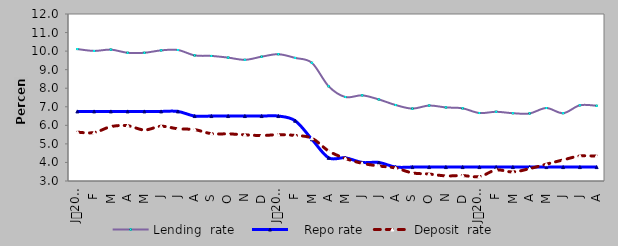
| Category | Lending  rate |    Repo rate | Deposit  rate |
|---|---|---|---|
| 0 | 10.11 | 6.75 | 5.63 |
| 1900-01-01 | 10.01 | 6.75 | 5.61 |
| 1900-01-02 | 10.08 | 6.75 | 5.93 |
| 1900-01-03 | 9.91 | 6.75 | 5.98 |
| 1900-01-04 | 9.91 | 6.75 | 5.75 |
| 1900-01-05 | 10.04 | 6.75 | 5.95 |
| 1900-01-06 | 10.06 | 6.75 | 5.813 |
| 1900-01-07 | 9.77 | 6.5 | 5.77 |
| 1900-01-08 | 9.74 | 6.5 | 5.55 |
| 1900-01-09 | 9.65 | 6.5 | 5.54 |
| 1900-01-10 | 9.53 | 6.5 | 5.49 |
| 1900-01-11 | 9.7 | 6.5 | 5.45 |
| 1900-01-12 | 9.833 | 6.5 | 5.497 |
| 1900-01-13 | 9.634 | 6.25 | 5.454 |
| 1900-01-14 | 9.369 | 5.25 | 5.304 |
| 1900-01-15 | 8.106 | 4.25 | 4.617 |
| 1900-01-16 | 7.526 | 4.25 | 4.216 |
| 1900-01-17 | 7.616 | 4 | 3.953 |
| 1900-01-18 | 7.394 | 4 | 3.809 |
| 1900-01-19 | 7.095 | 3.75 | 3.699 |
| 1900-01-20 | 6.902 | 3.75 | 3.437 |
| 1900-01-21 | 7.067 | 3.75 | 3.374 |
| 1900-01-22 | 6.965 | 3.75 | 3.276 |
| 1900-01-23 | 6.917 | 3.75 | 3.292 |
| 1900-01-24 | 6.663 | 3.75 | 3.236 |
| 1900-01-25 | 6.731 | 3.75 | 3.592 |
| 1900-01-26 | 6.653 | 3.75 | 3.488 |
| 1900-01-27 | 6.64 | 3.75 | 3.667 |
| 1900-01-28 | 6.933 | 3.75 | 3.907 |
| 1900-01-29 | 6.654 | 3.75 | 4.137 |
| 1900-01-30 | 7.081 | 3.75 | 4.347 |
| 1900-01-31 | 7.055 | 3.75 | 4.341 |